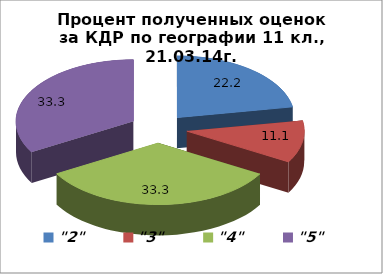
| Category | Series 0 |
|---|---|
| "2" | 22.222 |
| "3" | 11.111 |
| "4" | 33.333 |
| "5" | 33.333 |